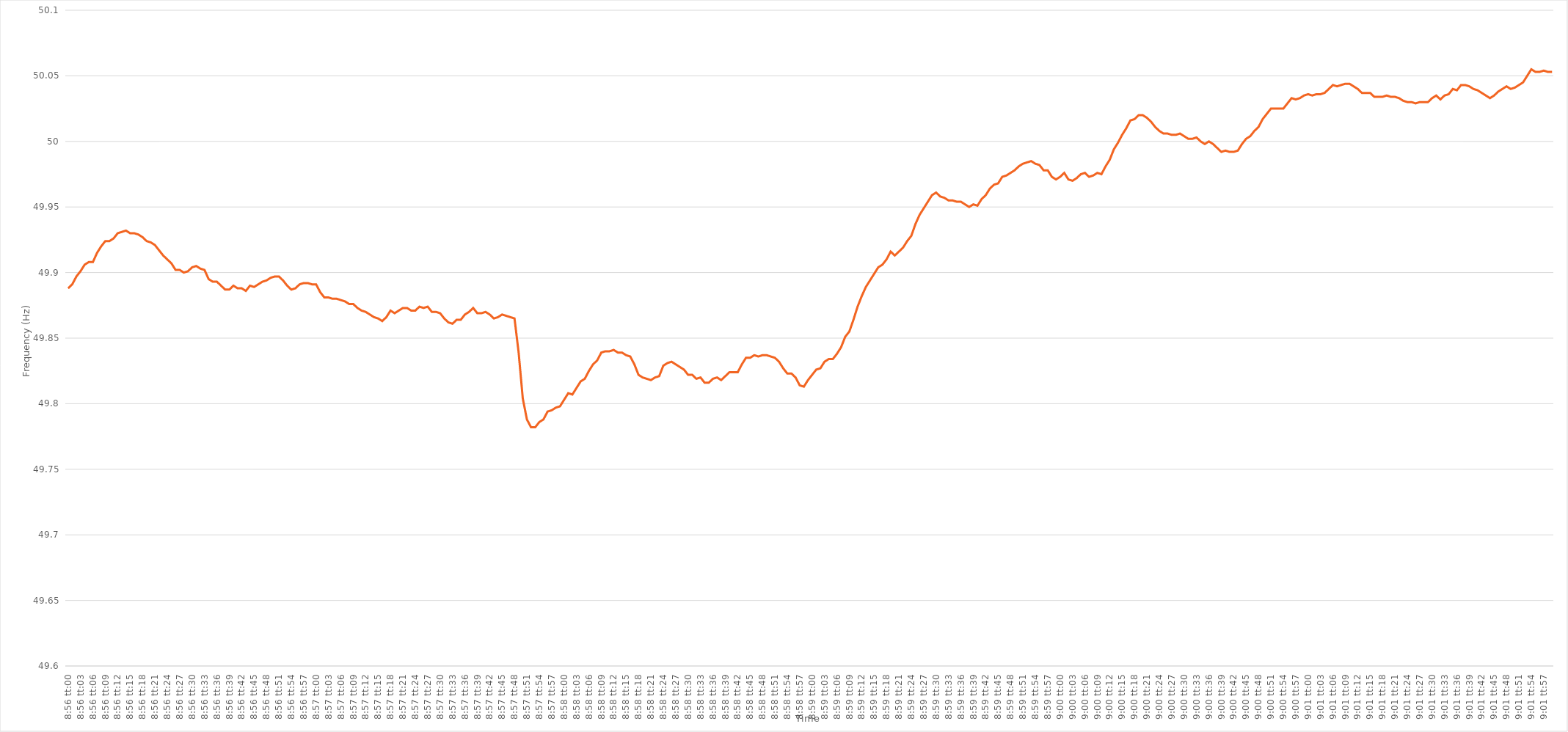
| Category | Series 0 |
|---|---|
| 0.37222222222222223 | 49.888 |
| 0.37223379629629627 | 49.891 |
| 0.37224537037037037 | 49.897 |
| 0.3722569444444444 | 49.901 |
| 0.37226851851851855 | 49.906 |
| 0.3722800925925926 | 49.908 |
| 0.3722916666666667 | 49.908 |
| 0.3723032407407407 | 49.915 |
| 0.3723148148148148 | 49.92 |
| 0.37232638888888886 | 49.924 |
| 0.372337962962963 | 49.924 |
| 0.37234953703703705 | 49.926 |
| 0.37236111111111114 | 49.93 |
| 0.3723726851851852 | 49.931 |
| 0.3723842592592593 | 49.932 |
| 0.3723958333333333 | 49.93 |
| 0.37240740740740735 | 49.93 |
| 0.3724189814814815 | 49.929 |
| 0.37243055555555554 | 49.927 |
| 0.37244212962962964 | 49.924 |
| 0.3724537037037037 | 49.923 |
| 0.37246527777777777 | 49.921 |
| 0.3724768518518518 | 49.917 |
| 0.37248842592592596 | 49.913 |
| 0.3725 | 49.91 |
| 0.3725115740740741 | 49.907 |
| 0.37252314814814813 | 49.902 |
| 0.3725347222222222 | 49.902 |
| 0.37254629629629626 | 49.9 |
| 0.3725578703703704 | 49.901 |
| 0.37256944444444445 | 49.904 |
| 0.37258101851851855 | 49.905 |
| 0.3725925925925926 | 49.903 |
| 0.3726041666666667 | 49.902 |
| 0.3726157407407407 | 49.895 |
| 0.37262731481481487 | 49.893 |
| 0.3726388888888889 | 49.893 |
| 0.37265046296296295 | 49.89 |
| 0.37266203703703704 | 49.887 |
| 0.3726736111111111 | 49.887 |
| 0.3726851851851852 | 49.89 |
| 0.3726967592592592 | 49.888 |
| 0.37270833333333336 | 49.888 |
| 0.3727199074074074 | 49.886 |
| 0.3727314814814815 | 49.89 |
| 0.37274305555555554 | 49.889 |
| 0.37275462962962963 | 49.891 |
| 0.37276620370370367 | 49.893 |
| 0.3727777777777778 | 49.894 |
| 0.37278935185185186 | 49.896 |
| 0.37280092592592595 | 49.897 |
| 0.3728125 | 49.897 |
| 0.3728240740740741 | 49.894 |
| 0.3728356481481481 | 49.89 |
| 0.3728472222222223 | 49.887 |
| 0.3728587962962963 | 49.888 |
| 0.37287037037037035 | 49.891 |
| 0.37288194444444445 | 49.892 |
| 0.3728935185185185 | 49.892 |
| 0.3729050925925926 | 49.891 |
| 0.3729166666666666 | 49.891 |
| 0.37292824074074077 | 49.885 |
| 0.3729398148148148 | 49.881 |
| 0.3729513888888889 | 49.881 |
| 0.37296296296296294 | 49.88 |
| 0.37297453703703703 | 49.88 |
| 0.3729861111111111 | 49.879 |
| 0.3729976851851852 | 49.878 |
| 0.37300925925925926 | 49.876 |
| 0.37302083333333336 | 49.876 |
| 0.3730324074074074 | 49.873 |
| 0.3730439814814815 | 49.871 |
| 0.37305555555555553 | 49.87 |
| 0.3730671296296297 | 49.868 |
| 0.3730787037037037 | 49.866 |
| 0.3730902777777778 | 49.865 |
| 0.37310185185185185 | 49.863 |
| 0.3731134259259259 | 49.866 |
| 0.373125 | 49.871 |
| 0.373136574074074 | 49.869 |
| 0.3731481481481482 | 49.871 |
| 0.3731597222222222 | 49.873 |
| 0.3731712962962963 | 49.873 |
| 0.37318287037037035 | 49.871 |
| 0.37319444444444444 | 49.871 |
| 0.3732060185185185 | 49.874 |
| 0.37321759259259263 | 49.873 |
| 0.37322916666666667 | 49.874 |
| 0.37324074074074076 | 49.87 |
| 0.3732523148148148 | 49.87 |
| 0.3732638888888889 | 49.869 |
| 0.37327546296296293 | 49.865 |
| 0.3732870370370371 | 49.862 |
| 0.3732986111111111 | 49.861 |
| 0.3733101851851852 | 49.864 |
| 0.37332175925925926 | 49.864 |
| 0.37333333333333335 | 49.868 |
| 0.3733449074074074 | 49.87 |
| 0.37335648148148143 | 49.873 |
| 0.3733680555555556 | 49.869 |
| 0.3733796296296296 | 49.869 |
| 0.3733912037037037 | 49.87 |
| 0.37340277777777775 | 49.868 |
| 0.37341435185185184 | 49.865 |
| 0.3734259259259259 | 49.866 |
| 0.37343750000000003 | 49.868 |
| 0.37344907407407407 | 49.867 |
| 0.37346064814814817 | 49.866 |
| 0.3734722222222222 | 49.865 |
| 0.3734837962962963 | 49.839 |
| 0.37349537037037034 | 49.804 |
| 0.3735069444444445 | 49.788 |
| 0.3735185185185185 | 49.782 |
| 0.3735300925925926 | 49.782 |
| 0.37354166666666666 | 49.786 |
| 0.37355324074074076 | 49.788 |
| 0.3735648148148148 | 49.794 |
| 0.37357638888888894 | 49.795 |
| 0.373587962962963 | 49.797 |
| 0.373599537037037 | 49.798 |
| 0.3736111111111111 | 49.803 |
| 0.37362268518518515 | 49.808 |
| 0.37363425925925925 | 49.807 |
| 0.3736458333333333 | 49.812 |
| 0.37365740740740744 | 49.817 |
| 0.3736689814814815 | 49.819 |
| 0.37368055555555557 | 49.825 |
| 0.3736921296296296 | 49.83 |
| 0.3737037037037037 | 49.833 |
| 0.37371527777777774 | 49.839 |
| 0.3737268518518519 | 49.84 |
| 0.37373842592592593 | 49.84 |
| 0.37375 | 49.841 |
| 0.37376157407407407 | 49.839 |
| 0.37377314814814816 | 49.839 |
| 0.3737847222222222 | 49.837 |
| 0.37379629629629635 | 49.836 |
| 0.3738078703703704 | 49.83 |
| 0.3738194444444444 | 49.822 |
| 0.3738310185185185 | 49.82 |
| 0.37384259259259256 | 49.819 |
| 0.37385416666666665 | 49.818 |
| 0.3738657407407407 | 49.82 |
| 0.37387731481481484 | 49.821 |
| 0.3738888888888889 | 49.829 |
| 0.373900462962963 | 49.831 |
| 0.373912037037037 | 49.832 |
| 0.3739236111111111 | 49.83 |
| 0.37393518518518515 | 49.828 |
| 0.3739467592592593 | 49.826 |
| 0.37395833333333334 | 49.822 |
| 0.37396990740740743 | 49.822 |
| 0.37398148148148147 | 49.819 |
| 0.37399305555555556 | 49.82 |
| 0.3740046296296296 | 49.816 |
| 0.37401620370370375 | 49.816 |
| 0.3740277777777778 | 49.819 |
| 0.3740393518518519 | 49.82 |
| 0.3740509259259259 | 49.818 |
| 0.37406249999999996 | 49.821 |
| 0.37407407407407406 | 49.824 |
| 0.3740856481481481 | 49.824 |
| 0.37409722222222225 | 49.824 |
| 0.3741087962962963 | 49.83 |
| 0.3741203703703704 | 49.835 |
| 0.3741319444444444 | 49.835 |
| 0.3741435185185185 | 49.837 |
| 0.37415509259259255 | 49.836 |
| 0.3741666666666667 | 49.837 |
| 0.37417824074074074 | 49.837 |
| 0.37418981481481484 | 49.836 |
| 0.3742013888888889 | 49.835 |
| 0.37421296296296297 | 49.832 |
| 0.374224537037037 | 49.827 |
| 0.37423611111111116 | 49.823 |
| 0.3742476851851852 | 49.823 |
| 0.3742592592592593 | 49.82 |
| 0.37427083333333333 | 49.814 |
| 0.3742824074074074 | 49.813 |
| 0.37429398148148146 | 49.818 |
| 0.3743055555555555 | 49.822 |
| 0.37431712962962965 | 49.826 |
| 0.3743287037037037 | 49.827 |
| 0.3743402777777778 | 49.832 |
| 0.3743518518518518 | 49.834 |
| 0.3743634259259259 | 49.834 |
| 0.37437499999999996 | 49.838 |
| 0.3743865740740741 | 49.843 |
| 0.37439814814814815 | 49.851 |
| 0.37440972222222224 | 49.855 |
| 0.3744212962962963 | 49.864 |
| 0.3744328703703704 | 49.874 |
| 0.3744444444444444 | 49.882 |
| 0.37445601851851856 | 49.889 |
| 0.3744675925925926 | 49.894 |
| 0.3744791666666667 | 49.899 |
| 0.37449074074074074 | 49.904 |
| 0.37450231481481483 | 49.906 |
| 0.37451388888888887 | 49.91 |
| 0.374525462962963 | 49.916 |
| 0.37453703703703706 | 49.913 |
| 0.3745486111111111 | 49.916 |
| 0.3745601851851852 | 49.919 |
| 0.37457175925925923 | 49.924 |
| 0.3745833333333333 | 49.928 |
| 0.37459490740740736 | 49.937 |
| 0.3746064814814815 | 49.944 |
| 0.37461805555555555 | 49.949 |
| 0.37462962962962965 | 49.954 |
| 0.3746412037037037 | 49.959 |
| 0.3746527777777778 | 49.961 |
| 0.3746643518518518 | 49.958 |
| 0.37467592592592597 | 49.957 |
| 0.3746875 | 49.955 |
| 0.3746990740740741 | 49.955 |
| 0.37471064814814814 | 49.954 |
| 0.37472222222222223 | 49.954 |
| 0.3747337962962963 | 49.952 |
| 0.3747453703703704 | 49.95 |
| 0.37475694444444446 | 49.952 |
| 0.3747685185185185 | 49.951 |
| 0.3747800925925926 | 49.956 |
| 0.37479166666666663 | 49.959 |
| 0.37480324074074073 | 49.964 |
| 0.37481481481481477 | 49.967 |
| 0.3748263888888889 | 49.968 |
| 0.37483796296296296 | 49.973 |
| 0.37484953703703705 | 49.974 |
| 0.3748611111111111 | 49.976 |
| 0.3748726851851852 | 49.978 |
| 0.3748842592592592 | 49.981 |
| 0.3748958333333334 | 49.983 |
| 0.3749074074074074 | 49.984 |
| 0.3749189814814815 | 49.985 |
| 0.37493055555555554 | 49.983 |
| 0.37494212962962964 | 49.982 |
| 0.3749537037037037 | 49.978 |
| 0.37496527777777783 | 49.978 |
| 0.37497685185185187 | 49.973 |
| 0.37498842592592596 | 49.971 |
| 0.375 | 49.973 |
| 0.37501157407407404 | 49.976 |
| 0.37502314814814813 | 49.971 |
| 0.37503472222222217 | 49.97 |
| 0.3750462962962963 | 49.972 |
| 0.37505787037037036 | 49.975 |
| 0.37506944444444446 | 49.976 |
| 0.3750810185185185 | 49.973 |
| 0.3750925925925926 | 49.974 |
| 0.3751041666666666 | 49.976 |
| 0.3751157407407408 | 49.975 |
| 0.3751273148148148 | 49.981 |
| 0.3751388888888889 | 49.986 |
| 0.37515046296296295 | 49.994 |
| 0.37516203703703704 | 49.999 |
| 0.3751736111111111 | 50.005 |
| 0.37518518518518523 | 50.01 |
| 0.37519675925925927 | 50.016 |
| 0.37520833333333337 | 50.017 |
| 0.3752199074074074 | 50.02 |
| 0.3752314814814815 | 50.02 |
| 0.37524305555555554 | 50.018 |
| 0.3752546296296296 | 50.015 |
| 0.3752662037037037 | 50.011 |
| 0.37527777777777777 | 50.008 |
| 0.37528935185185186 | 50.006 |
| 0.3753009259259259 | 50.006 |
| 0.3753125 | 50.005 |
| 0.37532407407407403 | 50.005 |
| 0.3753356481481482 | 50.006 |
| 0.3753472222222222 | 50.004 |
| 0.3753587962962963 | 50.002 |
| 0.37537037037037035 | 50.002 |
| 0.37538194444444445 | 50.003 |
| 0.3753935185185185 | 50 |
| 0.37540509259259264 | 49.998 |
| 0.3754166666666667 | 50 |
| 0.37542824074074077 | 49.998 |
| 0.3754398148148148 | 49.995 |
| 0.3754513888888889 | 49.992 |
| 0.37546296296296294 | 49.993 |
| 0.375474537037037 | 49.992 |
| 0.37548611111111113 | 49.992 |
| 0.37549768518518517 | 49.993 |
| 0.37550925925925926 | 49.998 |
| 0.3755208333333333 | 50.002 |
| 0.3755324074074074 | 50.004 |
| 0.37554398148148144 | 50.008 |
| 0.3755555555555556 | 50.011 |
| 0.3755671296296296 | 50.017 |
| 0.3755787037037037 | 50.021 |
| 0.37559027777777776 | 50.025 |
| 0.37560185185185185 | 50.025 |
| 0.3756134259259259 | 50.025 |
| 0.37562500000000004 | 50.025 |
| 0.3756365740740741 | 50.029 |
| 0.3756481481481482 | 50.033 |
| 0.3756597222222222 | 50.032 |
| 0.3756712962962963 | 50.033 |
| 0.37568287037037035 | 50.035 |
| 0.3756944444444445 | 50.036 |
| 0.37570601851851854 | 50.035 |
| 0.3757175925925926 | 50.036 |
| 0.37572916666666667 | 50.036 |
| 0.3757407407407407 | 50.037 |
| 0.3757523148148148 | 50.04 |
| 0.37576388888888884 | 50.043 |
| 0.375775462962963 | 50.042 |
| 0.37578703703703703 | 50.043 |
| 0.3757986111111111 | 50.044 |
| 0.37581018518518516 | 50.044 |
| 0.37582175925925926 | 50.042 |
| 0.3758333333333333 | 50.04 |
| 0.37584490740740745 | 50.037 |
| 0.3758564814814815 | 50.037 |
| 0.3758680555555556 | 50.037 |
| 0.3758796296296296 | 50.034 |
| 0.3758912037037037 | 50.034 |
| 0.37590277777777775 | 50.034 |
| 0.3759143518518519 | 50.035 |
| 0.37592592592592594 | 50.034 |
| 0.37593750000000004 | 50.034 |
| 0.3759490740740741 | 50.033 |
| 0.3759606481481481 | 50.031 |
| 0.3759722222222222 | 50.03 |
| 0.37598379629629625 | 50.03 |
| 0.3759953703703704 | 50.029 |
| 0.37600694444444444 | 50.03 |
| 0.37601851851851853 | 50.03 |
| 0.37603009259259257 | 50.03 |
| 0.37604166666666666 | 50.033 |
| 0.3760532407407407 | 50.035 |
| 0.37606481481481485 | 50.032 |
| 0.3760763888888889 | 50.035 |
| 0.376087962962963 | 50.036 |
| 0.376099537037037 | 50.04 |
| 0.3761111111111111 | 50.039 |
| 0.37612268518518516 | 50.043 |
| 0.3761342592592593 | 50.043 |
| 0.37614583333333335 | 50.042 |
| 0.37615740740740744 | 50.04 |
| 0.3761689814814815 | 50.039 |
| 0.3761805555555556 | 50.037 |
| 0.3761921296296296 | 50.035 |
| 0.37620370370370365 | 50.033 |
| 0.3762152777777778 | 50.035 |
| 0.37622685185185184 | 50.038 |
| 0.37623842592592593 | 50.04 |
| 0.37625 | 50.042 |
| 0.37626157407407407 | 50.04 |
| 0.3762731481481481 | 50.041 |
| 0.37628472222222226 | 50.043 |
| 0.3762962962962963 | 50.045 |
| 0.3763078703703704 | 50.05 |
| 0.37631944444444443 | 50.055 |
| 0.3763310185185185 | 50.053 |
| 0.37634259259259256 | 50.053 |
| 0.3763541666666667 | 50.054 |
| 0.37636574074074075 | 50.053 |
| 0.37637731481481485 | 50.053 |